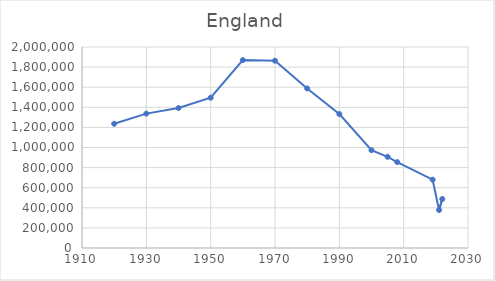
| Category | England |
|---|---|
| 1920.0 | 1236120 |
| 1930.0 | 1337150 |
| 1940.0 | 1392750 |
| 1950.0 | 1495390 |
| 1960.0 | 1869665 |
| 1970.0 | 1863263 |
| 1980.0 | 1587524 |
| 1990.0 | 1332826 |
| 2000.0 | 973000 |
| 2005.0 | 907427 |
| 2008.0 | 854877 |
| 2019.0 | 679914 |
| 2021.0 | 377906 |
| 2022.0 | 487191 |